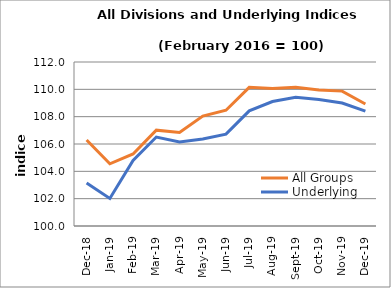
| Category | All Groups | Underlying |
|---|---|---|
| 2018-12-01 | 106.292 | 103.148 |
| 2019-01-01 | 104.55 | 102.019 |
| 2019-02-01 | 105.272 | 104.794 |
| 2019-03-01 | 107.012 | 106.51 |
| 2019-04-01 | 106.842 | 106.143 |
| 2019-05-01 | 108.044 | 106.37 |
| 2019-06-01 | 108.473 | 106.721 |
| 2019-07-01 | 110.146 | 108.423 |
| 2019-08-01 | 110.057 | 109.11 |
| 2019-09-01 | 110.148 | 109.423 |
| 2019-10-01 | 109.943 | 109.256 |
| 2019-11-01 | 109.87 | 108.998 |
| 2019-12-01 | 108.922 | 108.4 |